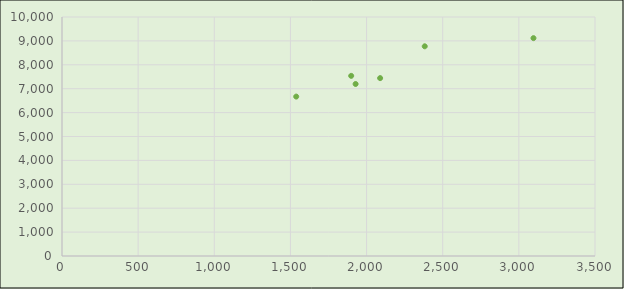
| Category | Series 0 |
|---|---|
| 2089.0 | 7443 |
| 3096.0 | 9116 |
| 2382.0 | 8774 |
| 1899.0 | 7537 |
| 1538.0 | 6670 |
| 1928.0 | 7197 |